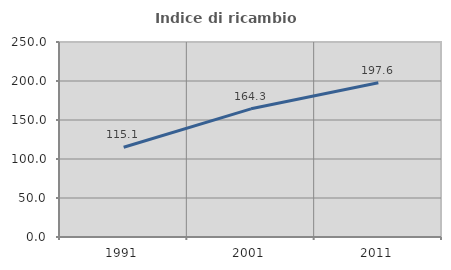
| Category | Indice di ricambio occupazionale  |
|---|---|
| 1991.0 | 115.068 |
| 2001.0 | 164.329 |
| 2011.0 | 197.647 |